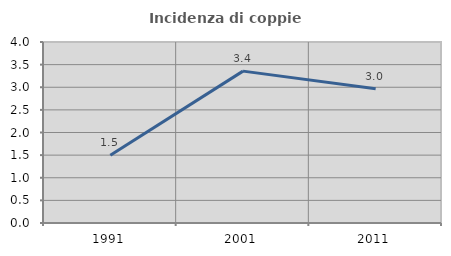
| Category | Incidenza di coppie miste |
|---|---|
| 1991.0 | 1.495 |
| 2001.0 | 3.357 |
| 2011.0 | 2.968 |